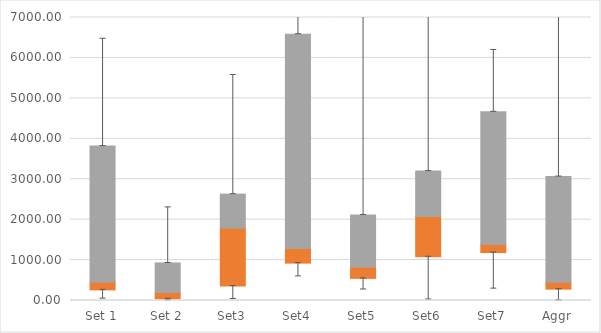
| Category | Q1 | Median-Q1 | Q3-Median |
|---|---|---|---|
| Set 1 | 262.42 | 191.104 | 3366.661 |
| Set 2 | 42.812 | 155.188 | 730.897 |
| Set3 | 356.171 | 1433.594 | 841.4 |
| Set4 | 924.39 | 364.249 | 5298.229 |
| Set5 | 546.888 | 276.84 | 1292.569 |
| Set6 | 1081.532 | 996.587 | 1124.999 |
| Set7 | 1186.183 | 201.086 | 3279.651 |
| Aggr | 280.866 | 172.657 | 2613.06 |